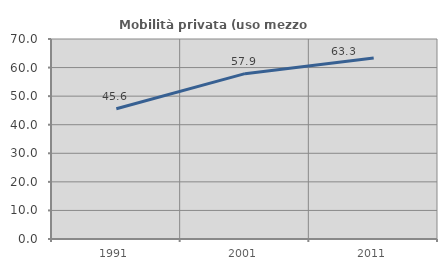
| Category | Mobilità privata (uso mezzo privato) |
|---|---|
| 1991.0 | 45.613 |
| 2001.0 | 57.863 |
| 2011.0 | 63.312 |